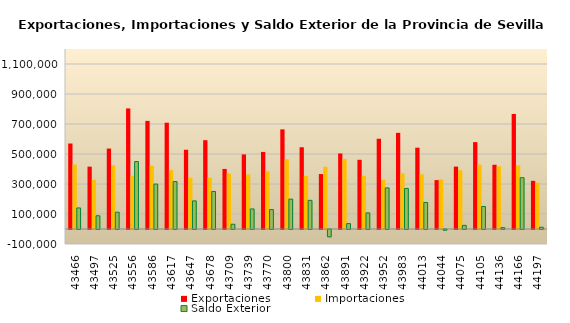
| Category | Exportaciones | Importaciones | Saldo Exterior |
|---|---|---|---|
| 2019-01-01 | 569931.277 | 429494.742 | 140436.534 |
| 2019-02-01 | 415835.783 | 327549.688 | 88286.094 |
| 2019-03-01 | 536289.213 | 424398.806 | 111890.407 |
| 2019-04-01 | 803799.832 | 354056.045 | 449743.787 |
| 2019-05-01 | 720786.65 | 421173.779 | 299612.871 |
| 2019-06-01 | 708636.402 | 392376.669 | 316259.734 |
| 2019-07-01 | 528188.273 | 340690.207 | 187498.067 |
| 2019-08-01 | 592019.511 | 341747.051 | 250272.46 |
| 2019-09-01 | 400434 | 368760 | 31674 |
| 2019-10-01 | 497188.203 | 363534.861 | 133653.342 |
| 2019-11-01 | 513902.151 | 384307.903 | 129594.248 |
| 2019-12-01 | 664224.395 | 464969.096 | 199255.3 |
| 2020-01-01 | 544870.53 | 354001.597 | 190868.934 |
| 2020-02-01 | 366257.686 | 415208.864 | -48951.178 |
| 2020-03-01 | 503457.961 | 467455.717 | 36002.244 |
| 2020-04-01 | 461491.765 | 354222.346 | 107269.419 |
| 2020-05-01 | 601776.553 | 327669.596 | 274106.957 |
| 2020-06-01 | 641019.697 | 370799.774 | 270219.922 |
| 2020-07-01 | 542062.842 | 365220.14 | 176842.702 |
| 2020-08-01 | 326019.875 | 330571.151 | -4551.276 |
| 2020-09-01 | 415851.902 | 391765.108 | 24086.795 |
| 2020-10-01 | 579330.618 | 429257.837 | 150072.781 |
| 2020-11-01 | 428116.983 | 418885.529 | 9231.454 |
| 2020-12-01 | 766984.753 | 424753.82 | 342230.933 |
| 2021-01-01 | 321034.509 | 309401.545 | 11632.963 |